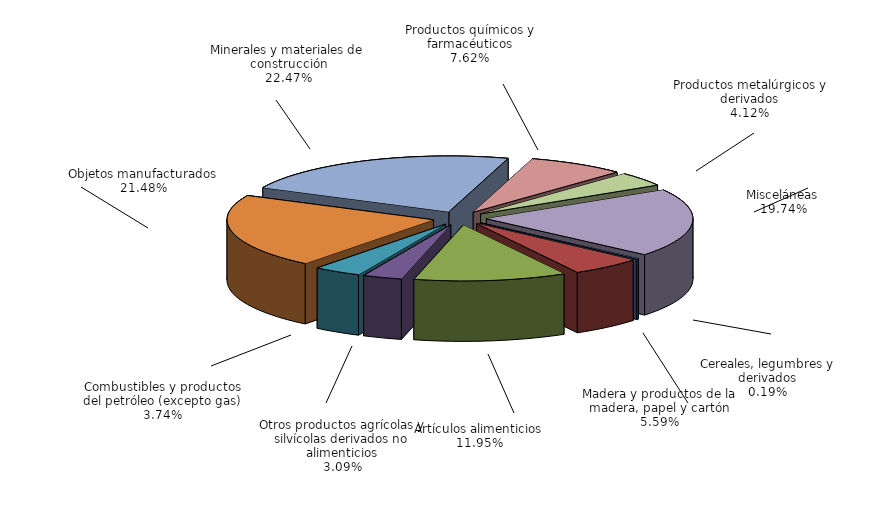
| Category | Series 0 |
|---|---|
| Cereales, legumbres y derivados | 0.193 |
| Madera y productos de la madera, papel y cartón | 5.588 |
| Artículos alimenticios | 11.947 |
| Otros productos agrícolas y silvícolas derivados no alimenticios | 3.092 |
| Combustibles y productos del petróleo (excepto gas) | 3.744 |
| Objetos manufacturados | 21.482 |
| Minerales y materiales de construcción | 22.475 |
| Productos químicos y farmacéuticos | 7.623 |
| Productos metalúrgicos y derivados | 4.118 |
| Misceláneas | 19.737 |